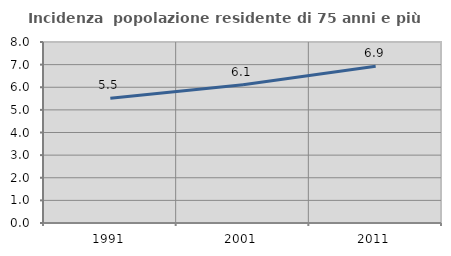
| Category | Incidenza  popolazione residente di 75 anni e più |
|---|---|
| 1991.0 | 5.515 |
| 2001.0 | 6.114 |
| 2011.0 | 6.929 |